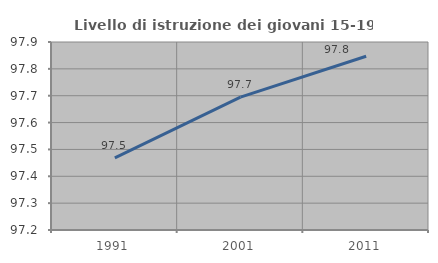
| Category | Livello di istruzione dei giovani 15-19 anni |
|---|---|
| 1991.0 | 97.468 |
| 2001.0 | 97.695 |
| 2011.0 | 97.847 |